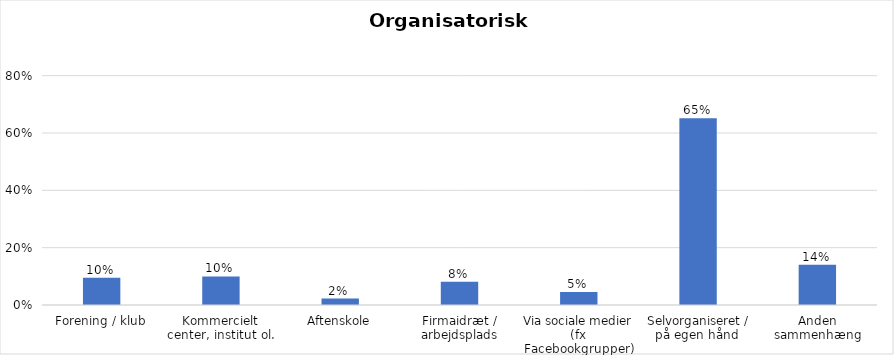
| Category | % |
|---|---|
| Forening / klub | 0.095 |
| Kommercielt center, institut ol. | 0.1 |
| Aftenskole | 0.023 |
| Firmaidræt / arbejdsplads | 0.081 |
| Via sociale medier (fx Facebookgrupper) | 0.045 |
| Selvorganiseret / på egen hånd  | 0.652 |
| Anden sammenhæng | 0.14 |